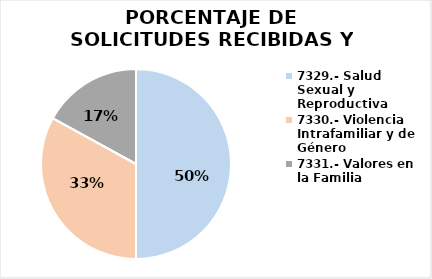
| Category | Series 0 |
|---|---|
| 7329.- Salud Sexual y Reproductiva | 0.5 |
| 7330.- Violencia Intrafamiliar y de Género | 0.33 |
| 7331.- Valores en la Familia | 0.17 |